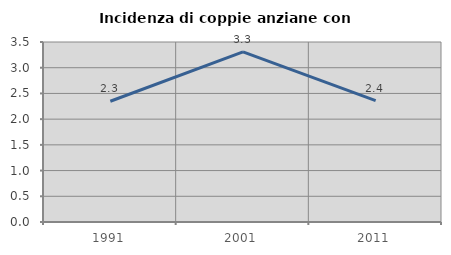
| Category | Incidenza di coppie anziane con figli |
|---|---|
| 1991.0 | 2.347 |
| 2001.0 | 3.31 |
| 2011.0 | 2.358 |